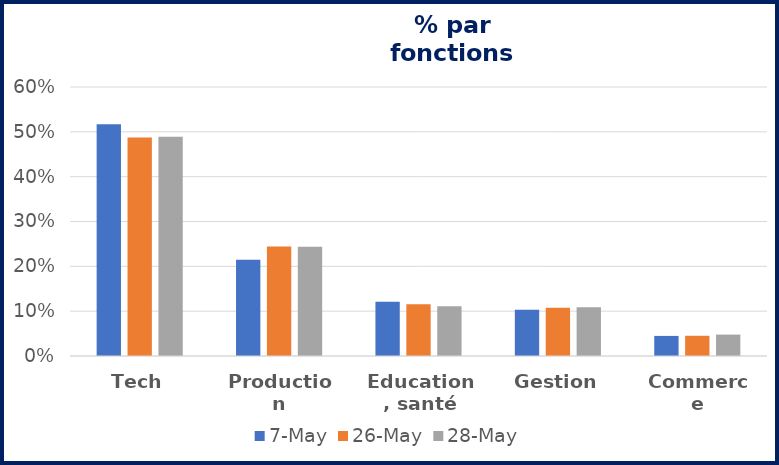
| Category | 07-mai | 26-mai | 28-mai |
|---|---|---|---|
| Tech | 0.517 | 0.488 | 0.489 |
| Production | 0.214 | 0.244 | 0.244 |
| Education, santé | 0.121 | 0.116 | 0.111 |
| Gestion | 0.103 | 0.108 | 0.109 |
| Commerce | 0.045 | 0.045 | 0.048 |